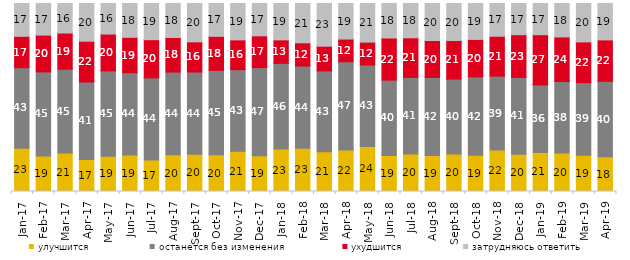
| Category | улучшится | останется без изменения | ухудшится | затрудняюсь ответить |
|---|---|---|---|---|
| 2017-01-01 | 23 | 42.85 | 16.7 | 17.45 |
| 2017-02-01 | 18.85 | 44.75 | 19.6 | 16.8 |
| 2017-03-01 | 20.5 | 44.55 | 19.25 | 15.7 |
| 2017-04-01 | 17 | 41.25 | 21.7 | 20.05 |
| 2017-05-01 | 18.7 | 45.45 | 19.6 | 16.25 |
| 2017-06-01 | 19.4 | 43.8 | 18.8 | 18 |
| 2017-07-01 | 16.7 | 43.75 | 20.3 | 19.25 |
| 2017-08-01 | 19.5 | 44.05 | 18.35 | 18.1 |
| 2017-09-01 | 19.8 | 43.75 | 16.05 | 20.4 |
| 2017-10-01 | 19.55 | 44.9 | 18.1 | 17.45 |
| 2017-11-01 | 21.45 | 43.35 | 15.85 | 19.35 |
| 2017-12-01 | 18.95 | 46.95 | 16.9 | 17.2 |
| 2018-01-01 | 22.55 | 45.6 | 12.5 | 19.35 |
| 2018-02-01 | 23 | 43.75 | 12.35 | 20.9 |
| 2018-03-01 | 21.15 | 43 | 13.15 | 22.7 |
| 2018-04-01 | 22.05 | 46.95 | 12.1 | 18.9 |
| 2018-05-01 | 23.95 | 43.35 | 12.15 | 20.55 |
| 2018-06-01 | 19.15 | 40.1 | 22.4 | 18.35 |
| 2018-07-01 | 19.95 | 40.7 | 21.1 | 18.25 |
| 2018-08-01 | 19.15 | 41.5 | 19.65 | 19.7 |
| 2018-09-01 | 19.95 | 39.85 | 20.5 | 19.7 |
| 2018-10-01 | 19.3 | 41.7 | 19.9 | 19.1 |
| 2018-11-01 | 22.056 | 39.321 | 21.208 | 17.415 |
| 2018-12-01 | 19.8 | 40.85 | 22.75 | 16.6 |
| 2019-01-01 | 20.75 | 35.95 | 26.7 | 16.6 |
| 2019-02-01 | 20.45 | 38.05 | 23.7 | 17.8 |
| 2019-03-01 | 19.344 | 38.538 | 21.681 | 20.438 |
| 2019-04-01 | 18.465 | 40.149 | 22.03 | 19.356 |